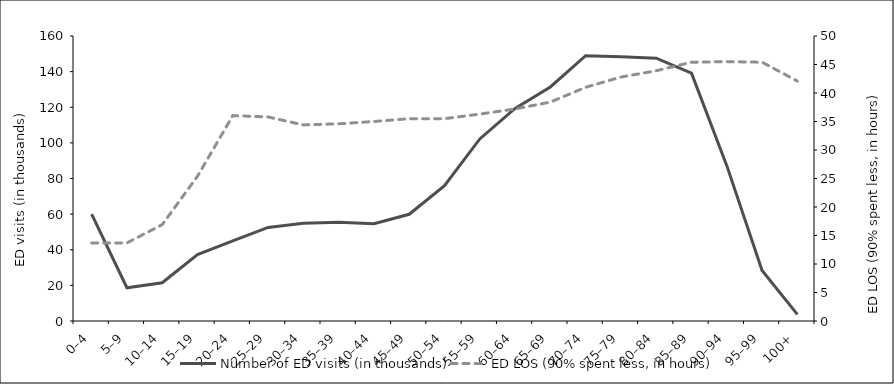
| Category | Number of ED visits (in thousands) |
|---|---|
| 0–4 | 59.944 |
| 5–9 | 18.662 |
| 10–14 | 21.463 |
| 15–19 | 37.326 |
| 20–24 | 44.994 |
| 25–29 | 52.511 |
| 30–34 | 54.94 |
| 35–39 | 55.415 |
| 40–44 | 54.665 |
| 45–49 | 59.915 |
| 50–54 | 75.924 |
| 55–59 | 102.195 |
| 60–64 | 119.381 |
| 65–69 | 131.417 |
| 70–74 | 148.958 |
| 75–79 | 148.308 |
| 80–84 | 147.57 |
| 85–89 | 139.139 |
| 90–94 | 87.223 |
| 95–99 | 28.367 |
| 100+ | 3.704 |